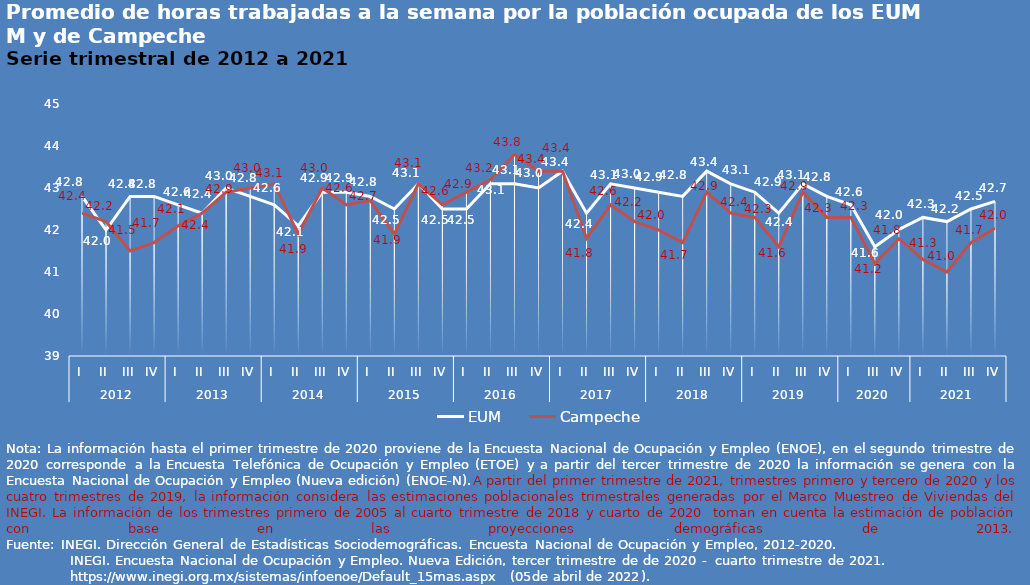
| Category | EUM | Campeche |
|---|---|---|
| 0 | 42.8 | 42.4 |
| 1 | 42 | 42.2 |
| 2 | 42.8 | 41.5 |
| 3 | 42.8 | 41.7 |
| 4 | 42.6 | 42.1 |
| 5 | 42.4 | 42.4 |
| 6 | 43 | 42.9 |
| 7 | 42.8 | 43 |
| 8 | 42.6 | 43.1 |
| 9 | 42.1 | 41.9 |
| 10 | 42.9 | 43 |
| 11 | 42.9 | 42.6 |
| 12 | 42.8 | 42.7 |
| 13 | 42.5 | 41.9 |
| 14 | 43.1 | 43.1 |
| 15 | 42.5 | 42.6 |
| 16 | 42.5 | 42.9 |
| 17 | 43.1 | 43.2 |
| 18 | 43.1 | 43.8 |
| 19 | 43 | 43.4 |
| 20 | 43.4 | 43.4 |
| 21 | 42.4 | 41.8 |
| 22 | 43.1 | 42.6 |
| 23 | 43 | 42.2 |
| 24 | 42.9 | 42 |
| 25 | 42.8 | 41.7 |
| 26 | 43.4 | 42.9 |
| 27 | 43.1 | 42.4 |
| 28 | 42.9 | 42.3 |
| 29 | 42.4 | 41.6 |
| 30 | 43.1 | 42.9 |
| 31 | 42.8 | 42.3 |
| 32 | 42.6 | 42.3 |
| 33 | 41.6 | 41.2 |
| 34 | 42.013 | 41.793 |
| 35 | 42.3 | 41.3 |
| 36 | 42.2 | 41 |
| 37 | 42.5 | 41.7 |
| 38 | 42.682 | 42.044 |